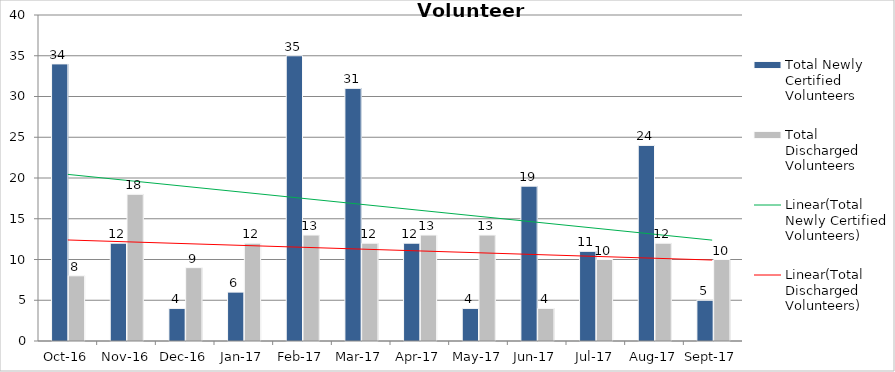
| Category | Total Newly Certified Volunteers | Total Discharged Volunteers |
|---|---|---|
| 2016-10-01 | 34 | 8 |
| 2016-11-01 | 12 | 18 |
| 2016-12-01 | 4 | 9 |
| 2017-01-01 | 6 | 12 |
| 2017-02-01 | 35 | 13 |
| 2017-03-01 | 31 | 12 |
| 2017-04-01 | 12 | 13 |
| 2017-05-01 | 4 | 13 |
| 2017-06-01 | 19 | 4 |
| 2017-07-01 | 11 | 10 |
| 2017-08-01 | 24 | 12 |
| 2017-09-01 | 5 | 10 |